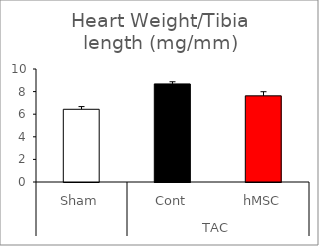
| Category | Series 0 |
|---|---|
| 0 | 6.435 |
| 1 | 8.681 |
| 2 | 7.625 |